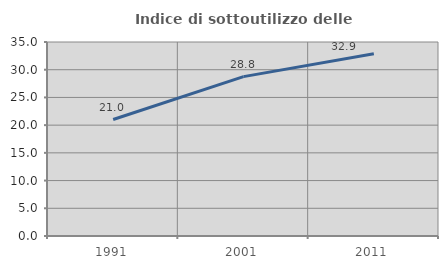
| Category | Indice di sottoutilizzo delle abitazioni  |
|---|---|
| 1991.0 | 21.014 |
| 2001.0 | 28.75 |
| 2011.0 | 32.886 |